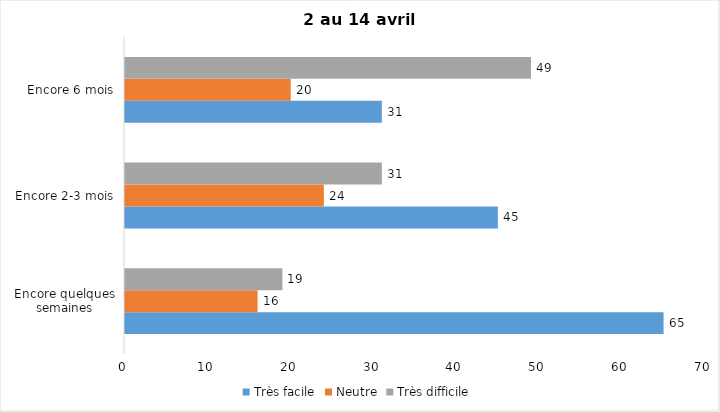
| Category | Très facile | Neutre | Très difficile |
|---|---|---|---|
| Encore quelques semaines | 65 | 16 | 19 |
| Encore 2-3 mois | 45 | 24 | 31 |
| Encore 6 mois | 31 | 20 | 49 |